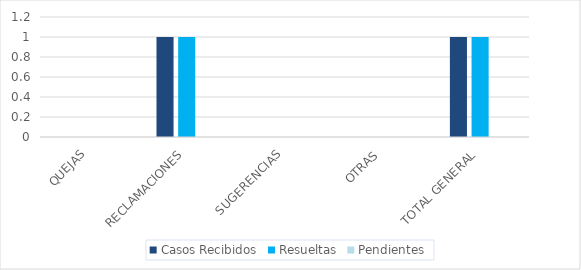
| Category | Casos Recibidos | Resueltas | Pendientes |
|---|---|---|---|
| QUEJAS | 0 | 0 | 0 |
| RECLAMACIONES | 1 | 1 | 0 |
| SUGERENCIAS | 0 | 0 | 0 |
| OTRAS | 0 | 0 | 0 |
| TOTAL GENERAL | 1 | 1 | 0 |